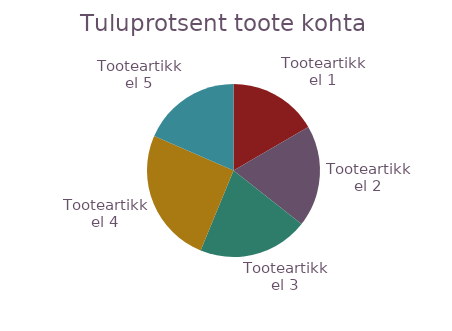
| Category | Kokku 
Sissetulekud |
|---|---|
| Tooteartikkel 1 | 196.75 |
| Tooteartikkel 2 | 224.625 |
| Tooteartikkel 3 | 244 |
| Tooteartikkel 4 | 300 |
| Tooteartikkel 5 | 218.4 |